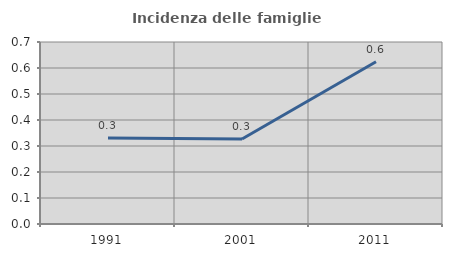
| Category | Incidenza delle famiglie numerose |
|---|---|
| 1991.0 | 0.331 |
| 2001.0 | 0.327 |
| 2011.0 | 0.624 |